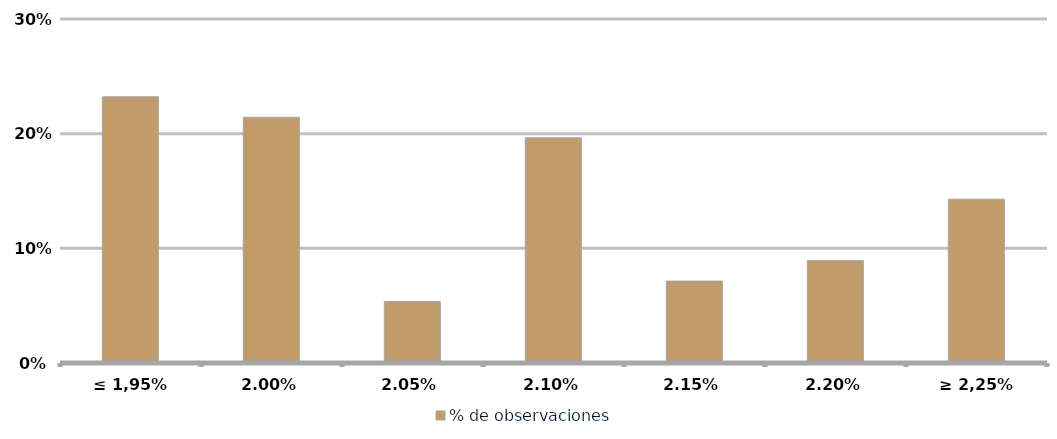
| Category | % de observaciones  |
|---|---|
| ≤ 1,95% | 0.232 |
| 2,00% | 0.214 |
| 2,05% | 0.054 |
| 2,10% | 0.196 |
| 2,15% | 0.071 |
| 2,20% | 0.089 |
| ≥ 2,25% | 0.143 |